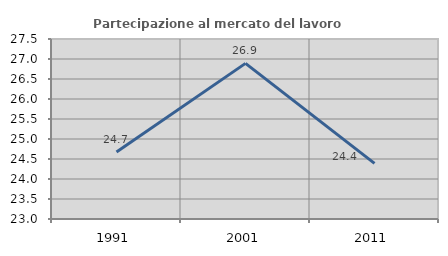
| Category | Partecipazione al mercato del lavoro  femminile |
|---|---|
| 1991.0 | 24.675 |
| 2001.0 | 26.891 |
| 2011.0 | 24.39 |